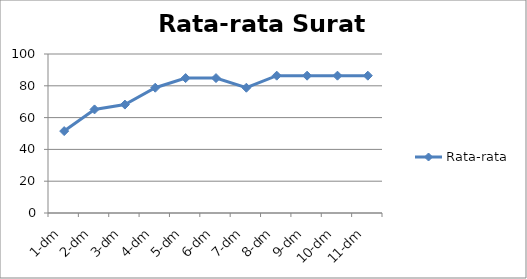
| Category | Rata-rata |
|---|---|
| 1-dm | 51.515 |
| 2-dm | 65.152 |
| 3-dm | 68.182 |
| 4-dm | 78.788 |
| 5-dm | 84.848 |
| 6-dm | 84.848 |
| 7-dm | 78.788 |
| 8-dm | 86.364 |
| 9-dm | 86.364 |
| 10-dm | 86.364 |
| 11-dm | 86.364 |